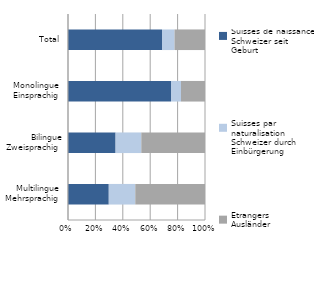
| Category | Suisses de naissance
Schweizer seit Geburt | Suisses par naturalisation
Schweizer durch Einbürgerung | Etrangers
Ausländer | Series 0 |
|---|---|---|---|---|
|    Multilingue
Mehrsprachig | 2263.259 | 1471.899 | 3870.829 |  |
|         Bilingue
Zweisprachig | 12036.043 | 6505.482 | 16115.907 |  |
| Monolingue
Einsprachig | 168304.506 | 16302.811 | 39222.264 |  |
| Total | 182603.808 | 24280.192 | 59209 |  |